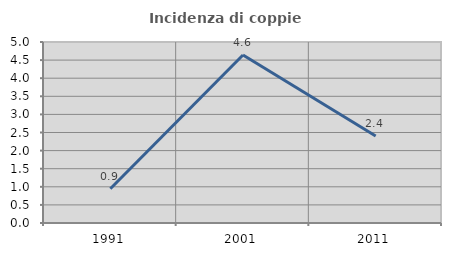
| Category | Incidenza di coppie miste |
|---|---|
| 1991.0 | 0.948 |
| 2001.0 | 4.639 |
| 2011.0 | 2.404 |